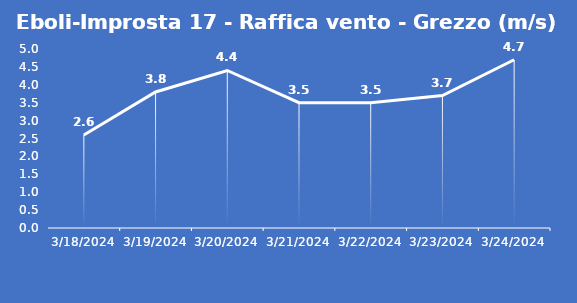
| Category | Eboli-Improsta 17 - Raffica vento - Grezzo (m/s) |
|---|---|
| 3/18/24 | 2.6 |
| 3/19/24 | 3.8 |
| 3/20/24 | 4.4 |
| 3/21/24 | 3.5 |
| 3/22/24 | 3.5 |
| 3/23/24 | 3.7 |
| 3/24/24 | 4.7 |